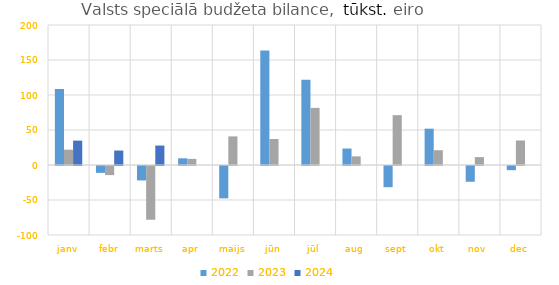
| Category | 2022 | 2023 | 2024 |
|---|---|---|---|
| janv | 108554.179 | 21850.373 | 34837.439 |
| febr | -9818.538 | -12989.478 | 20635.979 |
| marts | -20590.078 | -76739.856 | 27777.341 |
| apr | 9551.101 | 8730.038 | 0 |
| maijs | -46228.723 | 40875.463 | 0 |
| jūn | 163534.283 | 37142.428 | 0 |
| jūl | 121861.127 | 81614.598 | 0 |
| aug | 23515.069 | 12345.427 | 0 |
| sept | -30249.526 | 71171.512 | 0 |
| okt | 51869.404 | 21120.694 | 0 |
| nov | -22523.369 | 11303.868 | 0 |
| dec | -5948.69 | 34987.715 | 0 |